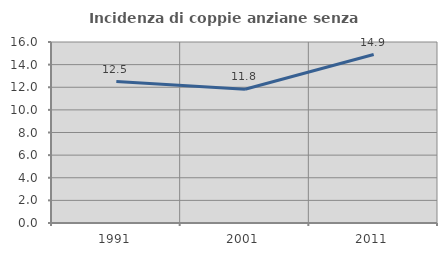
| Category | Incidenza di coppie anziane senza figli  |
|---|---|
| 1991.0 | 12.5 |
| 2001.0 | 11.828 |
| 2011.0 | 14.894 |